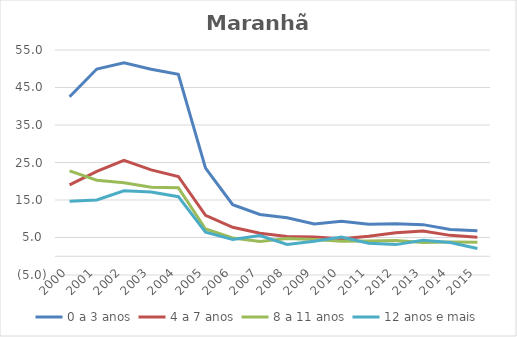
| Category | 0 a 3 anos | 4 a 7 anos | 8 a 11 anos | 12 anos e mais |
|---|---|---|---|---|
| 2000.0 | 42.519 | 19.058 | 22.768 | 14.696 |
| 2001.0 | 49.933 | 22.607 | 20.273 | 15.012 |
| 2002.0 | 51.595 | 25.552 | 19.62 | 17.478 |
| 2003.0 | 49.849 | 23.043 | 18.407 | 17.148 |
| 2004.0 | 48.53 | 21.272 | 18.297 | 15.882 |
| 2005.0 | 23.507 | 10.913 | 7.275 | 6.401 |
| 2006.0 | 13.761 | 7.718 | 4.856 | 4.475 |
| 2007.0 | 11.139 | 6.146 | 3.928 | 5.538 |
| 2008.0 | 10.257 | 5.271 | 4.727 | 3.165 |
| 2009.0 | 8.615 | 5.112 | 4.486 | 4 |
| 2010.0 | 9.304 | 4.681 | 4.027 | 5.107 |
| 2011.0 | 8.535 | 5.324 | 4.085 | 3.448 |
| 2012.0 | 8.651 | 6.257 | 4.19 | 3.105 |
| 2013.0 | 8.428 | 6.715 | 3.697 | 4.275 |
| 2014.0 | 7.139 | 5.571 | 3.792 | 3.664 |
| 2015.0 | 6.776 | 5.071 | 3.731 | 2.046 |